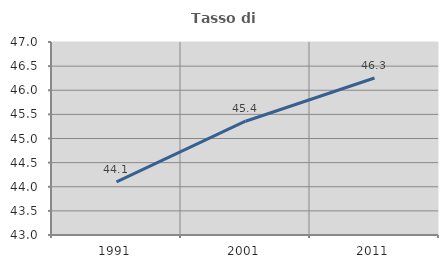
| Category | Tasso di occupazione   |
|---|---|
| 1991.0 | 44.1 |
| 2001.0 | 45.358 |
| 2011.0 | 46.253 |